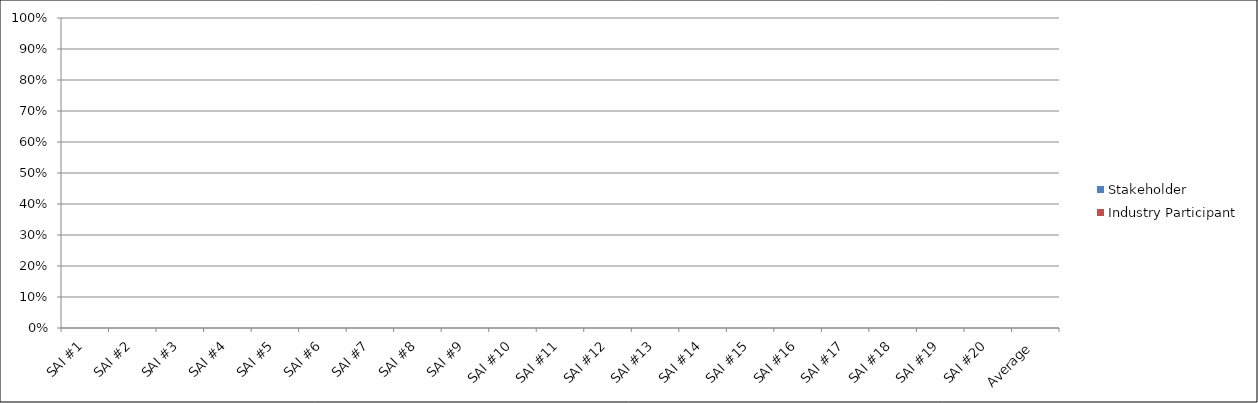
| Category | Stakeholder | Industry Participant |
|---|---|---|
| SAI #1 | 0 | 0 |
| SAI #2 | 0 | 0 |
| SAI #3 | 0 | 0 |
| SAI #4 | 0 | 0 |
| SAI #5 | 0 | 0 |
| SAI #6 | 0 | 0 |
| SAI #7 | 0 | 0 |
| SAI #8 | 0 | 0 |
| SAI #9 | 0 | 0 |
| SAI #10 | 0 | 0 |
| SAI #11 | 0 | 0 |
| SAI #12 | 0 | 0 |
| SAI #13 | 0 | 0 |
| SAI #14 | 0 | 0 |
| SAI #15 | 0 | 0 |
| SAI #16 | 0 | 0 |
| SAI #17 | 0 | 0 |
| SAI #18 | 0 | 0 |
| SAI #19 | 0 | 0 |
| SAI #20 | 0 | 0 |
| Average | 0 | 0 |